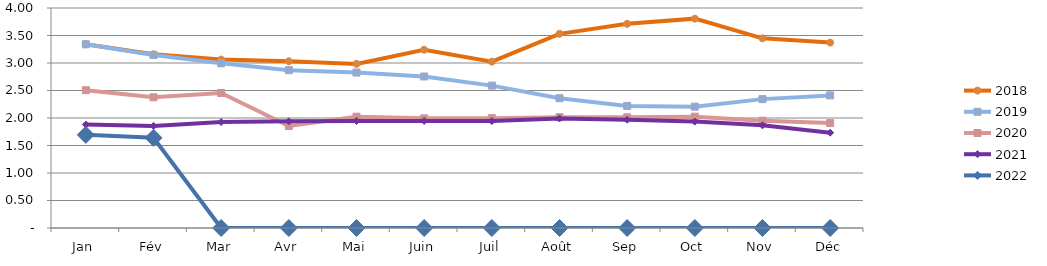
| Category | 2018 | 2019 | 2020 | 2021 | 2022 |
|---|---|---|---|---|---|
| Jan | 3.34 | 3.341 | 2.506 | 1.881 | 1.693 |
| Fév | 3.159 | 3.145 | 2.376 | 1.856 | 1.64 |
| Mar | 3.062 | 2.994 | 2.455 | 1.926 | 0 |
| Avr | 3.031 | 2.87 | 1.855 | 1.939 | 0 |
| Mai | 2.984 | 2.827 | 2.023 | 1.946 | 0 |
| Juin | 3.242 | 2.755 | 1.993 | 1.947 | 0 |
| Juil | 3.025 | 2.589 | 1.998 | 1.943 | 0 |
| Août | 3.53 | 2.359 | 2.015 | 1.992 | 0 |
| Sep | 3.712 | 2.22 | 2.012 | 1.968 | 0 |
| Oct | 3.806 | 2.206 | 2.024 | 1.935 | 0 |
| Nov | 3.449 | 2.343 | 1.95 | 1.867 | 0 |
| Déc | 3.371 | 2.411 | 1.909 | 1.733 | 0 |